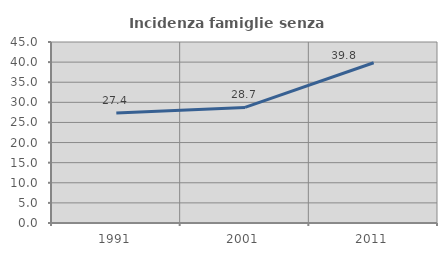
| Category | Incidenza famiglie senza nuclei |
|---|---|
| 1991.0 | 27.368 |
| 2001.0 | 28.732 |
| 2011.0 | 39.848 |